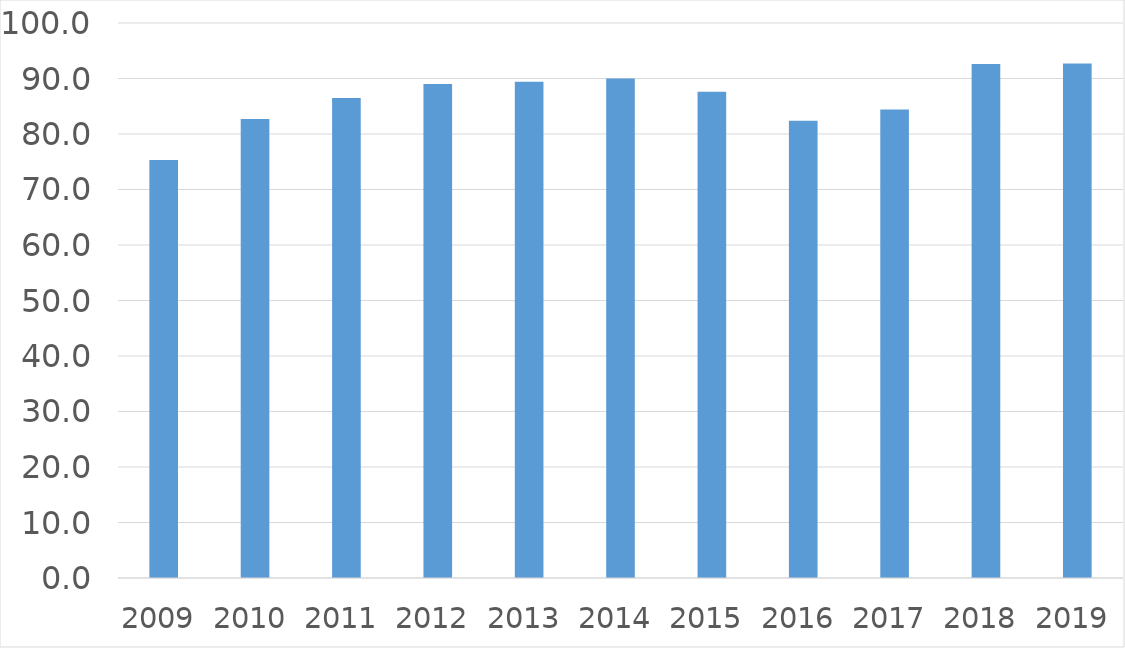
| Category | Series 0 |
|---|---|
| 2009 | 75.3 |
| 2010 | 82.7 |
| 2011 | 86.5 |
| 2012 | 89 |
| 2013 | 89.4 |
| 2014 | 90 |
| 2015 | 87.6 |
| 2016 | 82.4 |
| 2017 | 84.4 |
| 2018 | 92.6 |
| 2019 | 92.7 |